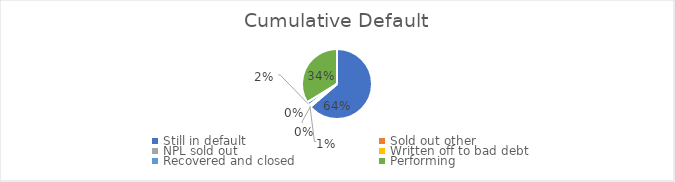
| Category | Series 0 |
|---|---|
| Still in default | 0.637 |
| Sold out other | 0 |
| NPL sold out | 0.006 |
| Written off to bad debt | 0.002 |
| Recovered and closed | 0.016 |
| Performing | 0.338 |